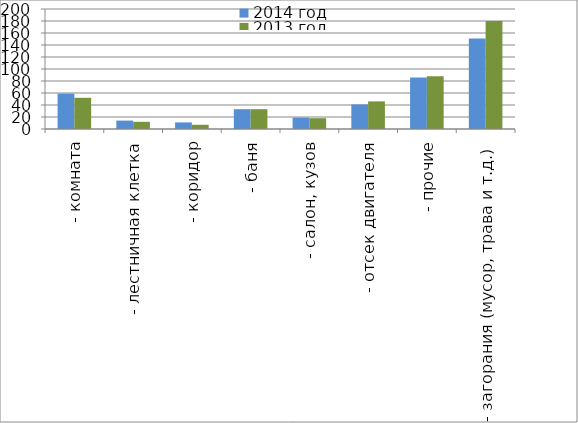
| Category | 2014 год | 2013 год |
|---|---|---|
|  - комната | 59 | 52 |
|  - лестничная клетка | 14 | 12 |
|  - коридор | 11 | 7 |
|  - баня | 33 | 33 |
|  - салон, кузов | 19 | 18 |
|  - отсек двигателя | 41 | 46 |
| - прочие | 86 | 88 |
| - загорания (мусор, трава и т.д.)  | 151 | 180 |